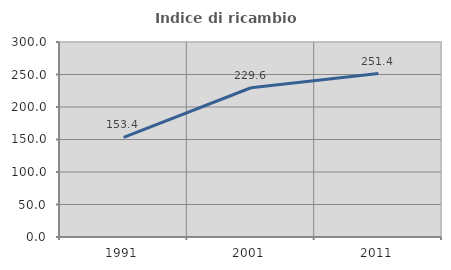
| Category | Indice di ricambio occupazionale  |
|---|---|
| 1991.0 | 153.4 |
| 2001.0 | 229.601 |
| 2011.0 | 251.406 |